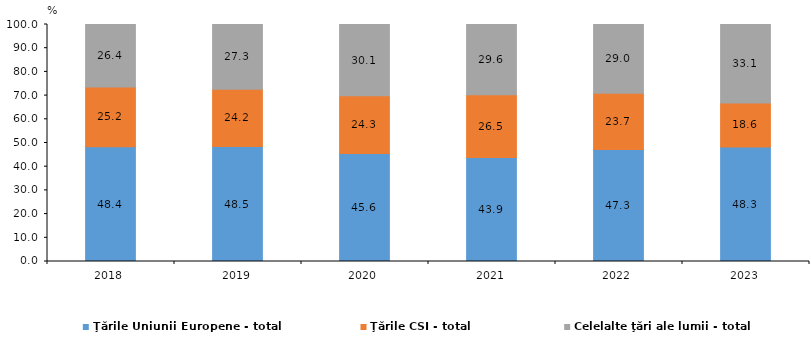
| Category | Ţările Uniunii Europene - total | Ţările CSI - total | Celelalte ţări ale lumii - total |
|---|---|---|---|
| 2018.0 | 48.4 | 25.2 | 26.4 |
| 2019.0 | 48.5 | 24.2 | 27.3 |
| 2020.0 | 45.6 | 24.3 | 30.1 |
| 2021.0 | 43.9 | 26.5 | 29.6 |
| 2022.0 | 47.3 | 23.7 | 29 |
| 2023.0 | 48.3 | 18.6 | 33.1 |